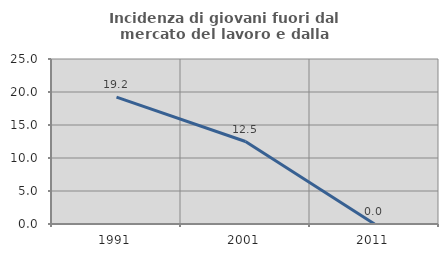
| Category | Incidenza di giovani fuori dal mercato del lavoro e dalla formazione  |
|---|---|
| 1991.0 | 19.231 |
| 2001.0 | 12.5 |
| 2011.0 | 0 |